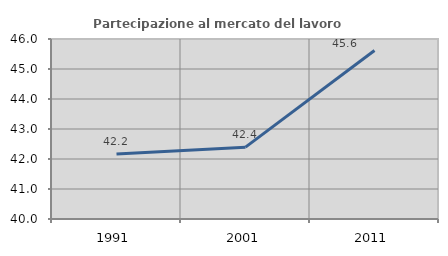
| Category | Partecipazione al mercato del lavoro  femminile |
|---|---|
| 1991.0 | 42.168 |
| 2001.0 | 42.396 |
| 2011.0 | 45.616 |